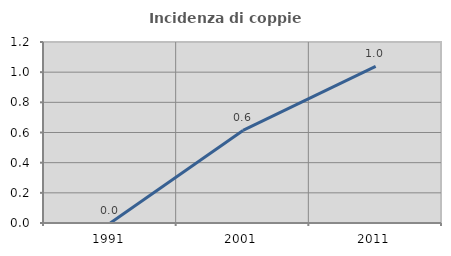
| Category | Incidenza di coppie miste |
|---|---|
| 1991.0 | 0 |
| 2001.0 | 0.613 |
| 2011.0 | 1.038 |